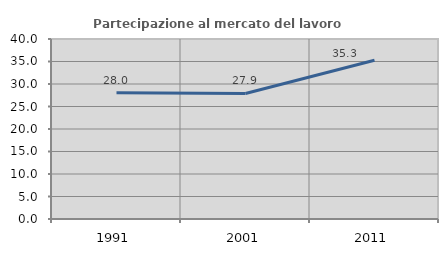
| Category | Partecipazione al mercato del lavoro  femminile |
|---|---|
| 1991.0 | 28.037 |
| 2001.0 | 27.895 |
| 2011.0 | 35.263 |